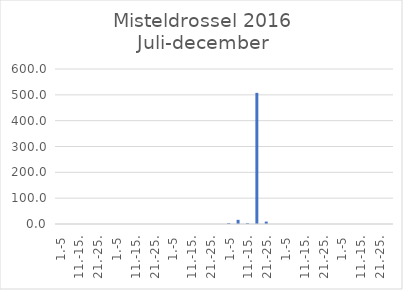
| Category | Series 0 |
|---|---|
| 1.-5 | 0 |
| 6.-10. | 0 |
| 11.-15. | 0 |
| 16.-20. | 0 |
| 21.-25. | 0 |
| 26.-31. | 0 |
| 1.-5 | 0 |
| 6.-10. | 0 |
| 11.-15. | 0 |
| 16.-20. | 0 |
| 21.-25. | 0 |
| 26.-31. | 0 |
| 1.-5 | 0 |
| 6.-10. | 0 |
| 11.-15. | 0 |
| 16.-20. | 0 |
| 21.-25. | 0 |
| 26.-30. | 0 |
| 1.-5 | 3.368 |
| 6.-10. | 16.023 |
| 11.-15. | 3.012 |
| 16.-20. | 507.631 |
| 21.-25. | 9.267 |
| 26.-31. | 0.108 |
| 1.-5 | 0 |
| 6.-10. | 0 |
| 11.-15. | 0 |
| 16.-20. | 0 |
| 21.-25. | 0 |
| 26.-30. | 0 |
| 1.-5 | 0.04 |
| 6.-10. | 0 |
| 11.-15. | 0 |
| 16.-20. | 0 |
| 21.-25. | 0 |
| 26.-31. | 0 |